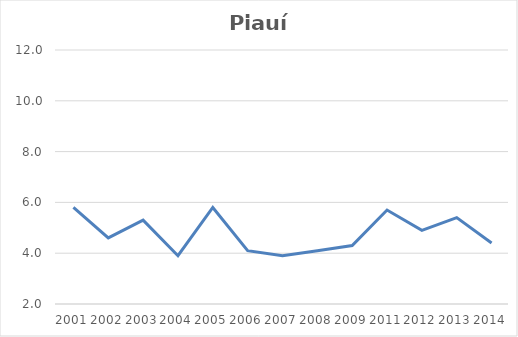
| Category | Total |
|---|---|
| 2001.0 | 5.8 |
| 2002.0 | 4.6 |
| 2003.0 | 5.3 |
| 2004.0 | 3.9 |
| 2005.0 | 5.8 |
| 2006.0 | 4.1 |
| 2007.0 | 3.9 |
| 2008.0 | 4.1 |
| 2009.0 | 4.3 |
| 2011.0 | 5.7 |
| 2012.0 | 4.9 |
| 2013.0 | 5.4 |
| 2014.0 | 4.4 |